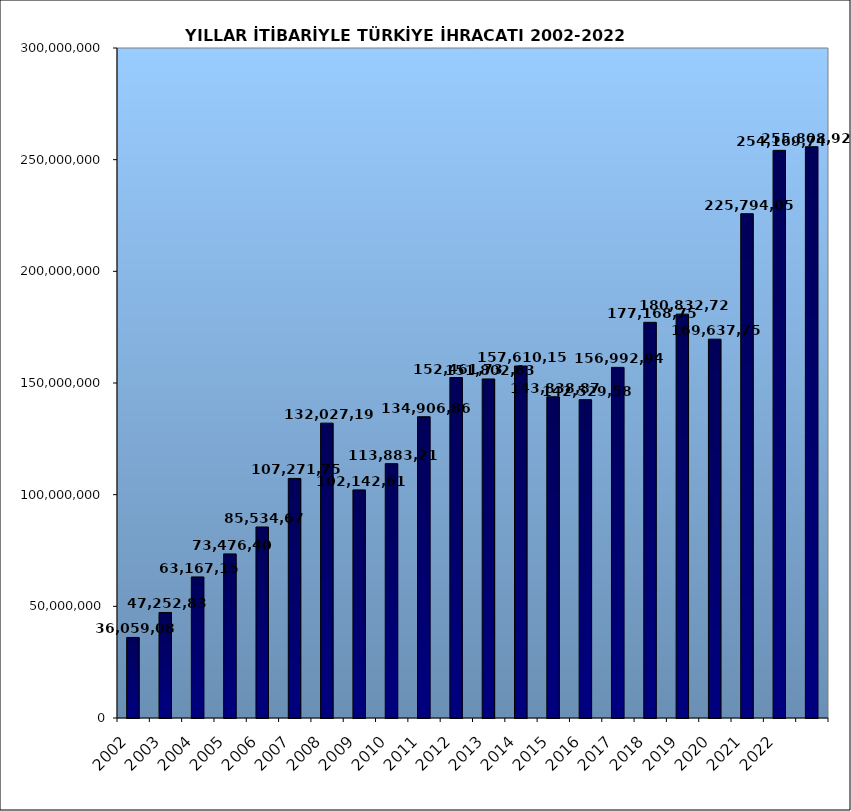
| Category | 2002 |
|---|---|
| 2002.0 | 36059089.029 |
| 2003.0 | 47252836.302 |
| 2004.0 | 63167152.82 |
| 2005.0 | 73476408.143 |
| 2006.0 | 85534675.518 |
| 2007.0 | 107271749.904 |
| 2008.0 | 132027195.626 |
| 2009.0 | 102142612.603 |
| 2010.0 | 113883219.184 |
| 2011.0 | 134906868.83 |
| 2012.0 | 152461736.556 |
| 2013.0 | 151802637.087 |
| 2014.0 | 157610157.69 |
| 2015.0 | 143838871.428 |
| 2016.0 | 142529583.808 |
| 2017.0 | 156992940.414 |
| 2018.0 | 177168756.288 |
| 2019.0 | 180832721.702 |
| 2020.0 | 169637755.31 |
| 2021.0 | 225794053.443 |
| 2022.0 | 254169747.663 |